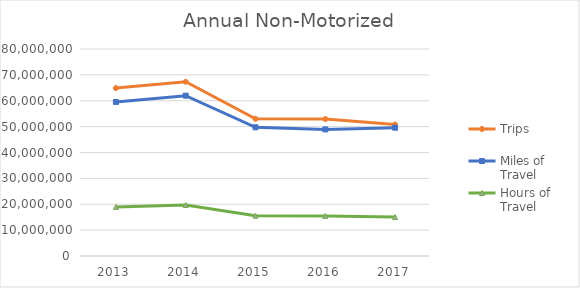
| Category | Trips | Miles of Travel | Hours of Travel |
|---|---|---|---|
| 2013 | 64893418.803 | 59540619.595 | 18973442.167 |
| 2014 | 67331971.823 | 61964598.675 | 19698717.143 |
| 2015 | 53030641.278 | 49735331.667 | 15576121.277 |
| 2016 | 52926431.38 | 48923267.136 | 15498441.125 |
| 2017 | 50825270.8 | 49588063.558 | 15054952.242 |